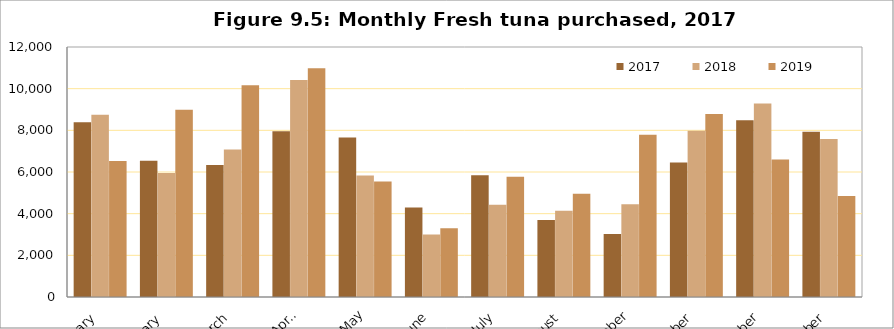
| Category | 2017 | 2018 | 2019 |
|---|---|---|---|
| January | 8385.24 | 8743.659 | 6523.044 |
| February | 6537.473 | 5954.814 | 8987.207 |
| March | 6336.251 | 7078.495 | 10165.657 |
| April | 7958.811 | 10419.583 | 10978.011 |
| May | 7659.902 | 5828.249 | 5539.466 |
| June | 4299.646 | 2995.827 | 3298.568 |
| July | 5847.243 | 4428.214 | 5777.654 |
| August | 3700.781 | 4136.373 | 4951.477 |
| September | 3018.05 | 4453.652 | 7790.864 |
| October | 6461.272 | 7975.299 | 8787.964 |
| November | 8485.294 | 9291.322 | 6594.389 |
| December | 7930.755 | 7580.65 | 4842.784 |